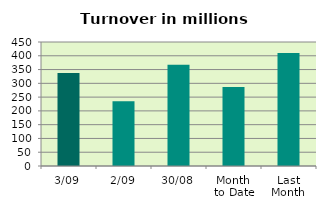
| Category | Series 0 |
|---|---|
| 3/09 | 337.727 |
| 2/09 | 235.386 |
| 30/08 | 367.264 |
| Month 
to Date | 286.556 |
| Last
Month | 410.207 |